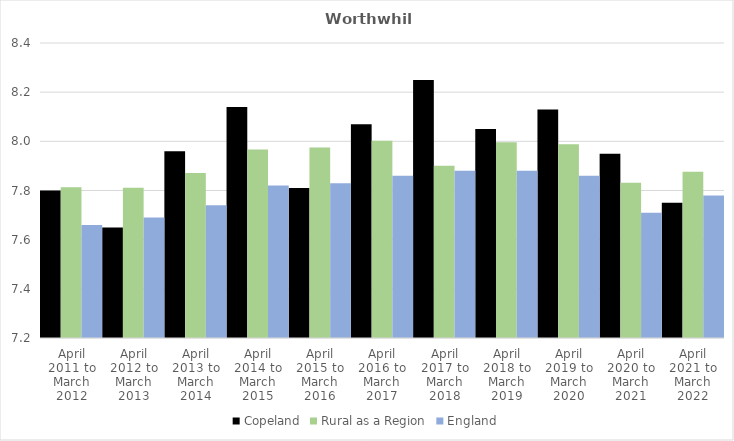
| Category | Copeland | Rural as a Region | England |
|---|---|---|---|
| April 2011 to March 2012 | 7.8 | 7.813 | 7.66 |
| April 2012 to March 2013 | 7.65 | 7.811 | 7.69 |
| April 2013 to March 2014 | 7.96 | 7.871 | 7.74 |
| April 2014 to March 2015 | 8.14 | 7.967 | 7.82 |
| April 2015 to March 2016 | 7.81 | 7.975 | 7.83 |
| April 2016 to March 2017 | 8.07 | 8.002 | 7.86 |
| April 2017 to March 2018 | 8.25 | 7.9 | 7.88 |
| April 2018 to March 2019 | 8.05 | 7.996 | 7.88 |
| April 2019 to March 2020 | 8.13 | 7.988 | 7.86 |
| April 2020 to March 2021 | 7.95 | 7.831 | 7.71 |
| April 2021 to March 2022 | 7.75 | 7.877 | 7.78 |